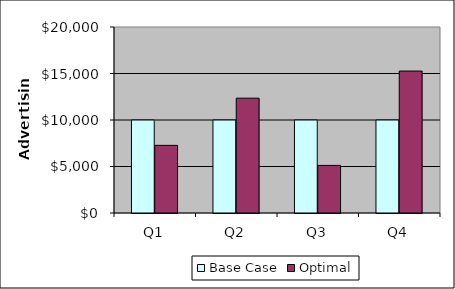
| Category | Base Case | Optimal |
|---|---|---|
| Q1 | 10000 | 7273.171 |
| Q2 | 10000 | 12346.341 |
| Q3 | 10000 | 5117.073 |
| Q4 | 10000 | 15263.415 |